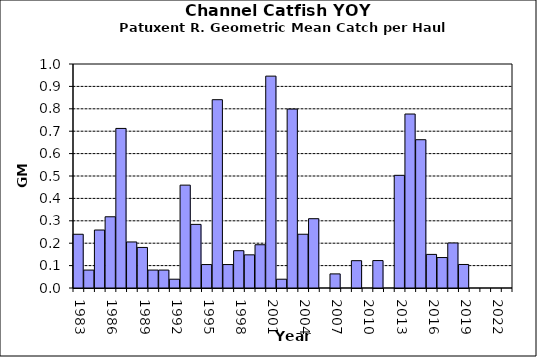
| Category | Series 0 |
|---|---|
| 1983.0 | 0.24 |
| 1984.0 | 0.08 |
| 1985.0 | 0.259 |
| 1986.0 | 0.318 |
| 1987.0 | 0.712 |
| 1988.0 | 0.206 |
| 1989.0 | 0.181 |
| 1990.0 | 0.08 |
| 1991.0 | 0.08 |
| 1992.0 | 0.039 |
| 1993.0 | 0.459 |
| 1994.0 | 0.284 |
| 1995.0 | 0.105 |
| 1996.0 | 0.841 |
| 1997.0 | 0.105 |
| 1998.0 | 0.167 |
| 1999.0 | 0.148 |
| 2000.0 | 0.193 |
| 2001.0 | 0.946 |
| 2002.0 | 0.039 |
| 2003.0 | 0.799 |
| 2004.0 | 0.24 |
| 2005.0 | 0.309 |
| 2006.0 | 0 |
| 2007.0 | 0.063 |
| 2008.0 | 0 |
| 2009.0 | 0.122 |
| 2010.0 | 0 |
| 2011.0 | 0.122 |
| 2012.0 | 0 |
| 2013.0 | 0.503 |
| 2014.0 | 0.777 |
| 2015.0 | 0.662 |
| 2016.0 | 0.15 |
| 2017.0 | 0.136 |
| 2018.0 | 0.201 |
| 2019.0 | 0.105 |
| 2020.0 | 0 |
| 2021.0 | 0 |
| 2022.0 | 0 |
| 2023.0 | 0 |